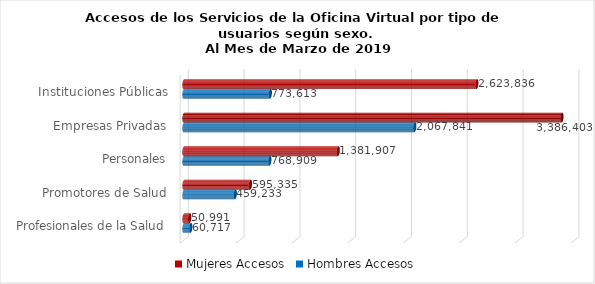
| Category | Mujeres | Hombres |
|---|---|---|
| Instituciones Públicas | 2623836 | 773613 |
| Empresas Privadas | 3386403 | 2067841 |
| Personales | 1381907 | 768909 |
| Promotores de Salud | 595335 | 459233 |
| Profesionales de la Salud | 50991 | 60717 |